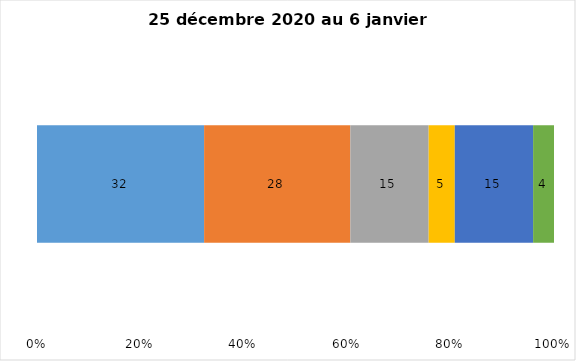
| Category | Plusieurs fois par jour | Une fois par jour | Quelques fois par semaine   | Une fois par semaine ou moins   |  Jamais   |  Je n’utilise pas les médias sociaux |
|---|---|---|---|---|---|---|
| 0 | 32 | 28 | 15 | 5 | 15 | 4 |